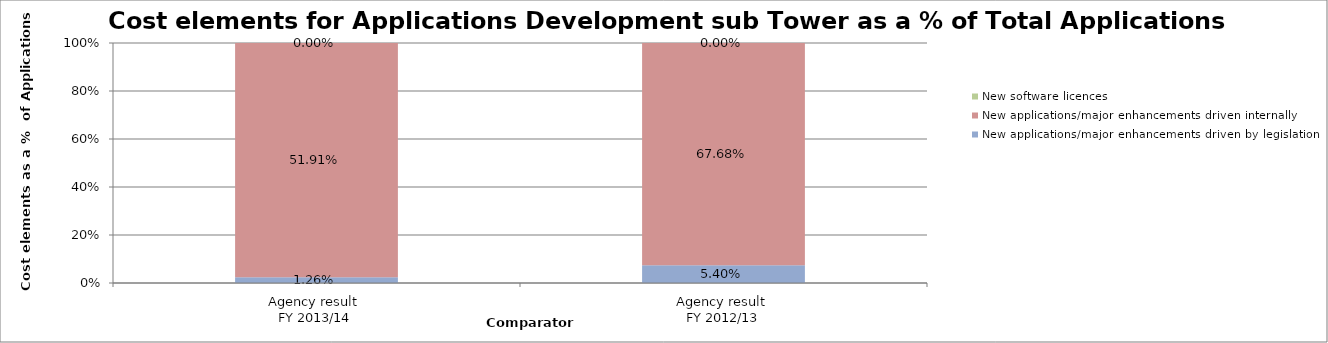
| Category | New applications/major enhancements driven by legislation | New applications/major enhancements driven internally | New software licences |
|---|---|---|---|
| Agency result 
FY 2013/14 | 0.013 | 0.519 | 0 |
| Agency result 
FY 2012/13 | 0.054 | 0.677 | 0 |